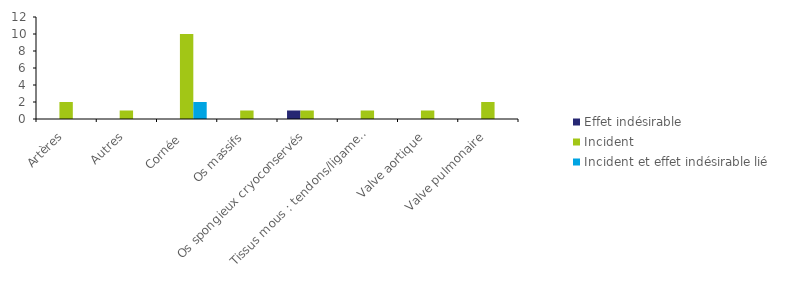
| Category | Effet indésirable | Incident | Incident et effet indésirable lié |
|---|---|---|---|
| Artères | 0 | 2 | 0 |
| Autres | 0 | 1 | 0 |
| Cornée  | 0 | 10 | 2 |
| Os massifs | 0 | 1 | 0 |
| Os spongieux cryoconservés | 1 | 1 | 0 |
| Tissus mous : tendons/ligaments | 0 | 1 | 0 |
| Valve aortique | 0 | 1 | 0 |
| Valve pulmonaire | 0 | 2 | 0 |